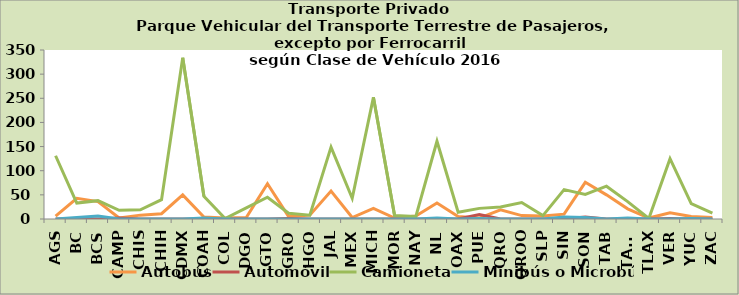
| Category | Autobús | Automóvil | Camioneta | Minibús o Microbús |
|---|---|---|---|---|
| AGS | 6 | 0 | 131 | 0 |
| BC | 43 | 1 | 33 | 3 |
| BCS | 36 | 0 | 38 | 6 |
| CAMP | 2 | 2 | 18 | 0 |
| CHIS | 8 | 0 | 19 | 0 |
| CHIH | 11 | 0 | 40 | 0 |
| CDMX | 50 | 0 | 334 | 0 |
| COAH | 4 | 0 | 47 | 2 |
| COL | 2 | 0 | 1 | 0 |
| DGO | 3 | 0 | 23 | 0 |
| GTO | 73 | 0 | 45 | 0 |
| GRO | 5 | 1 | 12 | 0 |
| HGO | 8 | 0 | 8 | 0 |
| JAL | 58 | 0 | 149 | 0 |
| MEX | 3 | 0 | 43 | 0 |
| MICH | 22 | 0 | 252 | 0 |
| MOR | 2 | 0 | 7 | 0 |
| NAY | 6 | 0 | 5 | 0 |
| NL | 33 | 0 | 161 | 2 |
| OAX | 5 | 0 | 14 | 0 |
| PUE | 2 | 9 | 22 | 1 |
| QRO | 19 | 0 | 25 | 0 |
| QROO | 7 | 0 | 34 | 0 |
| SLP | 6 | 0 | 7 | 0 |
| SIN | 10 | 0 | 61 | 4 |
| SON | 76 | 4 | 51 | 3 |
| TAB | 50 | 0 | 68 | 0 |
| TAMS | 21 | 0 | 36 | 2 |
| TLAX | 2 | 0 | 1 | 0 |
| VER | 13 | 1 | 125 | 0 |
| YUC | 5 | 0 | 32 | 1 |
| ZAC | 3 | 0 | 12 | 0 |